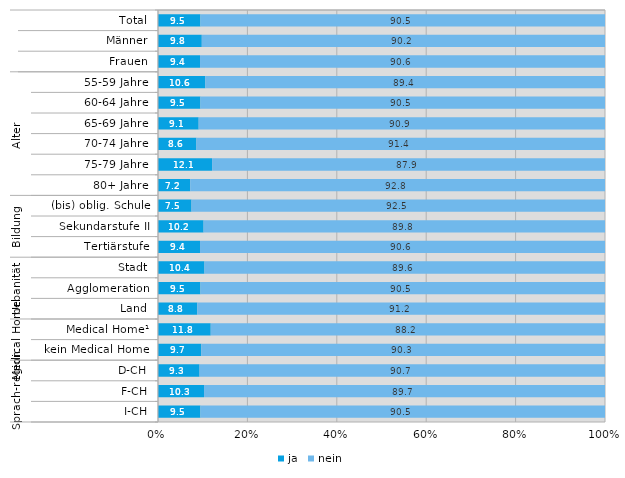
| Category | ja | nein |
|---|---|---|
| 0 | 9.5 | 90.5 |
| 1 | 9.8 | 90.2 |
| 2 | 9.4 | 90.6 |
| 3 | 10.6 | 89.4 |
| 4 | 9.5 | 90.5 |
| 5 | 9.1 | 90.9 |
| 6 | 8.6 | 91.4 |
| 7 | 12.1 | 87.9 |
| 8 | 7.2 | 92.8 |
| 9 | 7.5 | 92.5 |
| 10 | 10.2 | 89.8 |
| 11 | 9.4 | 90.6 |
| 12 | 10.4 | 89.6 |
| 13 | 9.5 | 90.5 |
| 14 | 8.8 | 91.2 |
| 15 | 11.8 | 88.2 |
| 16 | 9.7 | 90.3 |
| 17 | 9.3 | 90.7 |
| 18 | 10.3 | 89.7 |
| 19 | 9.5 | 90.5 |